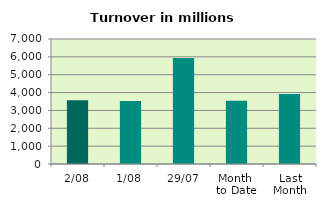
| Category | Series 0 |
|---|---|
| 2/08 | 3567.741 |
| 1/08 | 3524.415 |
| 29/07 | 5935.894 |
| Month 
to Date | 3546.078 |
| Last
Month | 3920.999 |